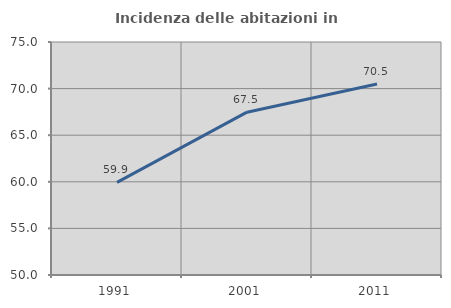
| Category | Incidenza delle abitazioni in proprietà  |
|---|---|
| 1991.0 | 59.937 |
| 2001.0 | 67.471 |
| 2011.0 | 70.492 |